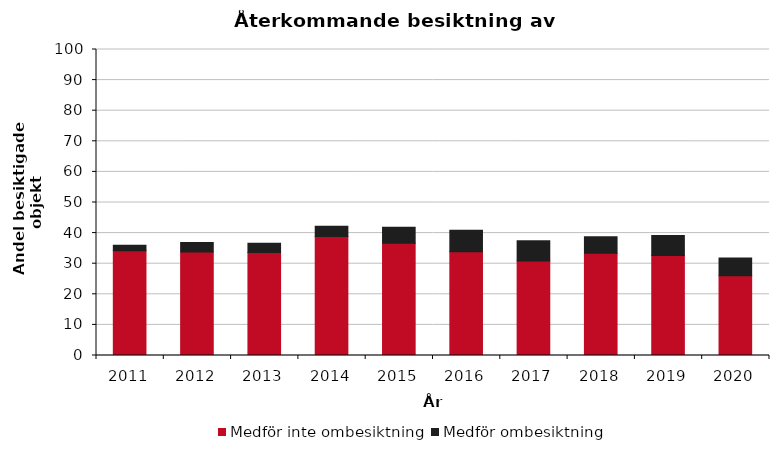
| Category | Medför inte ombesiktning | Medför ombesiktning |
|---|---|---|
| 2011.0 | 34.2 | 1.8 |
| 2012.0 | 33.8 | 3.1 |
| 2013.0 | 33.7 | 3 |
| 2014.0 | 38.9 | 3.3 |
| 2015.0 | 36.7 | 5.2 |
| 2016.0 | 33.9 | 7 |
| 2017.0 | 30.9 | 6.6 |
| 2018.0 | 33.4 | 5.4 |
| 2019.0 | 32.7 | 6.5 |
| 2020.0 | 26.1 | 5.8 |